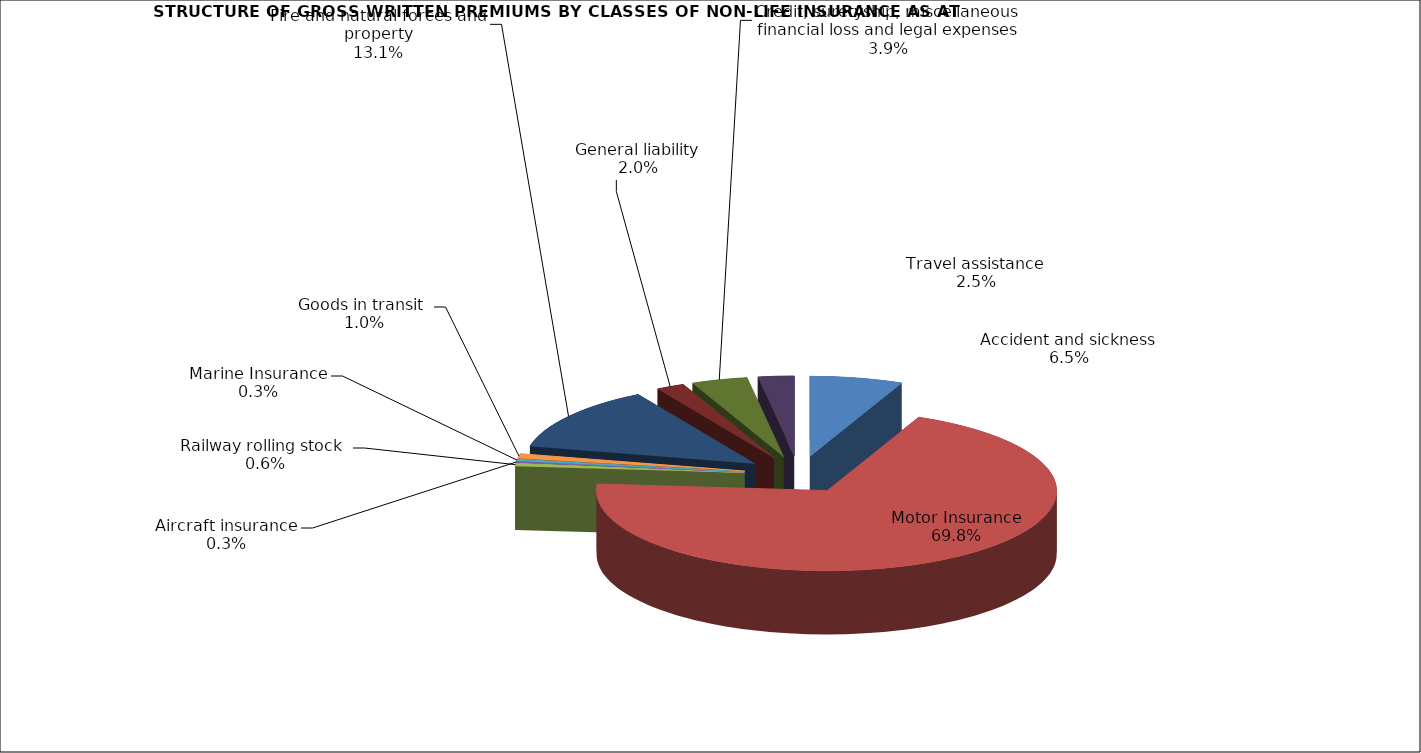
| Category | Accident and sickness |
|---|---|
| Accident and sickness | 0.065 |
| Motor Insurance | 0.698 |
| Railway rolling stock  | 0.006 |
| Aircraft insurance | 0.003 |
| Marine Insurance | 0.003 |
| Goods in transit  | 0.01 |
| Fire and natural forces and property | 0.131 |
| General liability | 0.02 |
| Credit, suretyship, miscellaneous financial loss and legal expenses | 0.039 |
| Travel assistance | 0.025 |